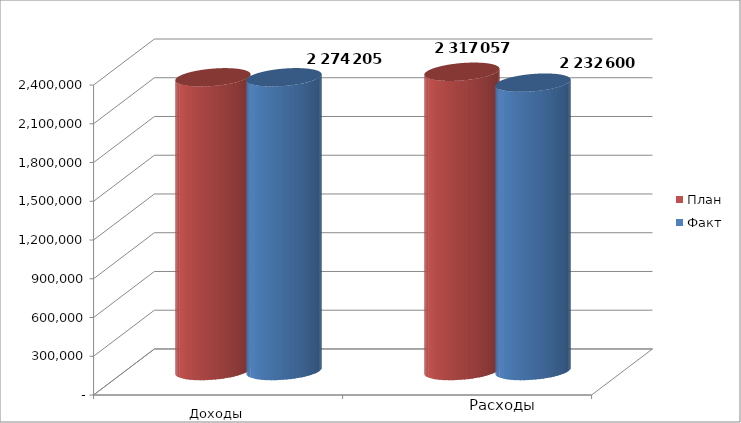
| Category | План | Факт |
|---|---|---|
| 0 | 2274001 | 2274205 |
| 1 | 2317057 | 2232599.58 |